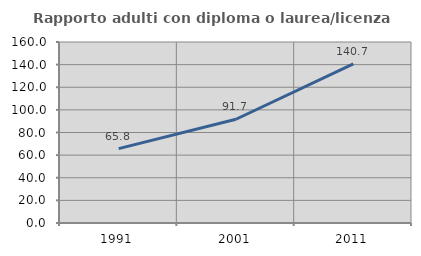
| Category | Rapporto adulti con diploma o laurea/licenza media  |
|---|---|
| 1991.0 | 65.767 |
| 2001.0 | 91.712 |
| 2011.0 | 140.685 |